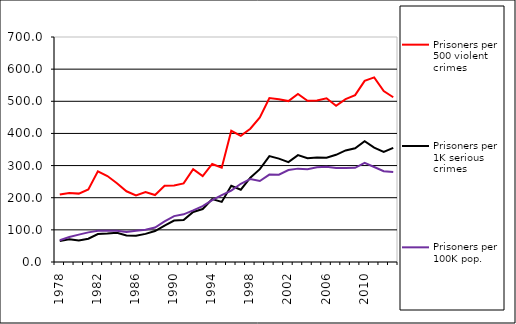
| Category | Prisoners per 500 violent crimes | Prisoners per 1K serious crimes | Prisoners per 100K pop. |
|---|---|---|---|
| 1978.0 | 209.777 | 65.612 | 67.714 |
| 1979.0 | 214.965 | 70.597 | 77.885 |
| 1980.0 | 212.753 | 66.611 | 85.253 |
| 1981.0 | 225.697 | 72.476 | 92.164 |
| 1982.0 | 281.885 | 86.904 | 97.384 |
| 1983.0 | 267.389 | 88.321 | 96.867 |
| 1984.0 | 245.286 | 91.078 | 97.457 |
| 1985.0 | 220.029 | 82.792 | 93.169 |
| 1986.0 | 207.146 | 81.777 | 97.404 |
| 1987.0 | 217.534 | 87.553 | 100.6 |
| 1988.0 | 208.408 | 96.348 | 107.057 |
| 1989.0 | 236.943 | 113.364 | 126.197 |
| 1990.0 | 238.373 | 128.928 | 142.865 |
| 1991.0 | 244.485 | 130.576 | 148.301 |
| 1992.0 | 289.023 | 155.723 | 160.669 |
| 1993.0 | 267.387 | 164.799 | 174.058 |
| 1994.0 | 304.97 | 195.674 | 192.188 |
| 1995.0 | 293.218 | 186.911 | 207.811 |
| 1996.0 | 408.056 | 237.306 | 222.37 |
| 1997.0 | 392.376 | 224.938 | 243.268 |
| 1998.0 | 414.648 | 262.217 | 258.351 |
| 1999.0 | 450.087 | 288.749 | 252.038 |
| 2000.0 | 510.198 | 329.563 | 271.843 |
| 2001.0 | 506.167 | 321.697 | 271.558 |
| 2002.0 | 500.596 | 310.68 | 286.051 |
| 2003.0 | 522.691 | 332.659 | 290.485 |
| 2004.0 | 501.53 | 322.587 | 288.699 |
| 2005.0 | 502.3 | 325.473 | 294.619 |
| 2006.0 | 509.219 | 324.128 | 296.37 |
| 2007.0 | 485.921 | 333.524 | 292.231 |
| 2008.0 | 506.647 | 347.182 | 292.787 |
| 2009.0 | 519.328 | 353.879 | 292.999 |
| 2010.0 | 563.303 | 375.685 | 308.172 |
| 2011.0 | 574.464 | 355.79 | 295.585 |
| 2012.0 | 531.774 | 342.4 | 282.468 |
| 2013.0 | 512.496 | 355.24 | 279.853 |